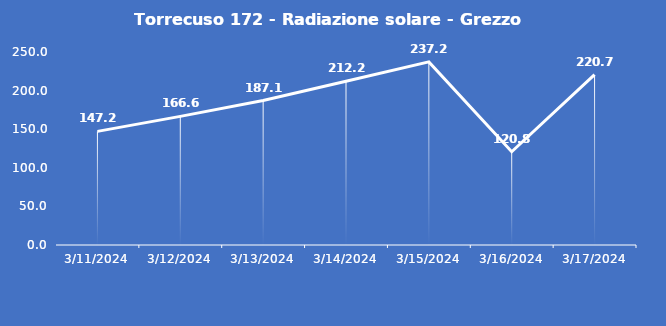
| Category | Torrecuso 172 - Radiazione solare - Grezzo (W/m2) |
|---|---|
| 3/11/24 | 147.2 |
| 3/12/24 | 166.6 |
| 3/13/24 | 187.1 |
| 3/14/24 | 212.2 |
| 3/15/24 | 237.2 |
| 3/16/24 | 120.8 |
| 3/17/24 | 220.7 |